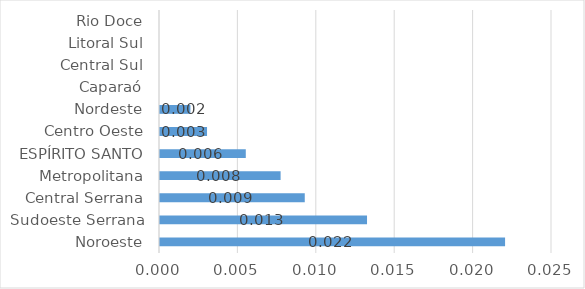
| Category | Series 0 |
|---|---|
| Noroeste | 0.022 |
| Sudoeste Serrana | 0.013 |
| Central Serrana | 0.009 |
| Metropolitana | 0.008 |
| ESPÍRITO SANTO | 0.006 |
| Centro Oeste | 0.003 |
| Nordeste | 0.002 |
| Caparaó | 0 |
| Central Sul | 0 |
| Litoral Sul | 0 |
| Rio Doce | 0 |